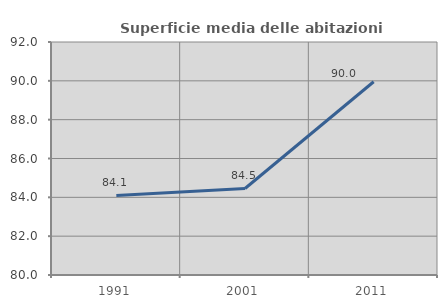
| Category | Superficie media delle abitazioni occupate |
|---|---|
| 1991.0 | 84.095 |
| 2001.0 | 84.456 |
| 2011.0 | 89.953 |